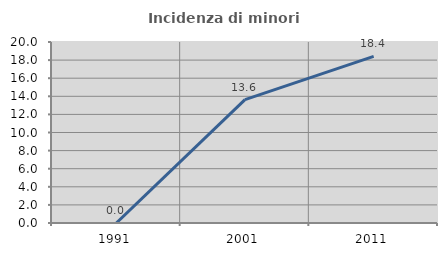
| Category | Incidenza di minori stranieri |
|---|---|
| 1991.0 | 0 |
| 2001.0 | 13.636 |
| 2011.0 | 18.405 |